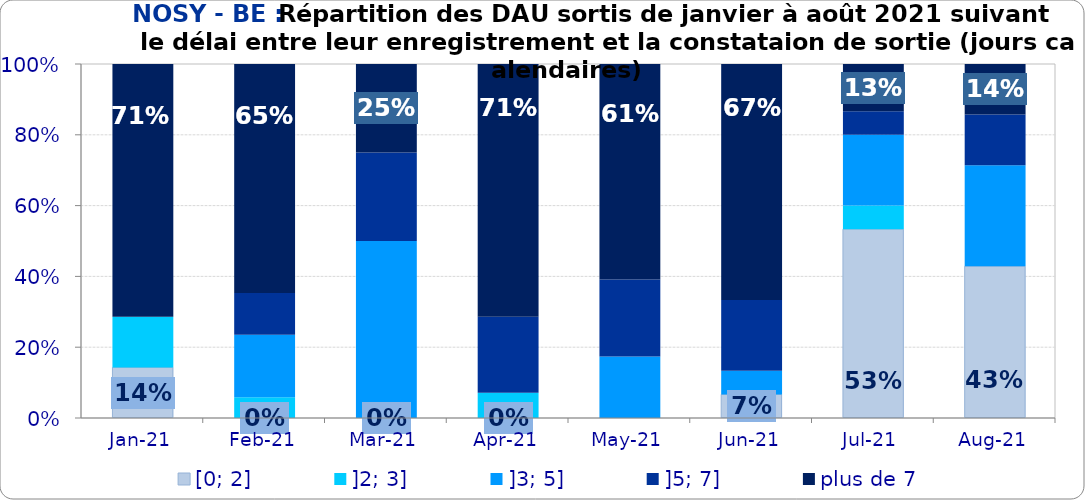
| Category | [0; 2] | ]2; 3] | ]3; 5] | ]5; 7] | plus de 7 |
|---|---|---|---|---|---|
| 2021-01-01 | 0.143 | 0.143 | 0 | 0 | 0.714 |
| 2021-02-01 | 0 | 0.059 | 0.176 | 0.118 | 0.647 |
| 2021-03-01 | 0 | 0 | 0.5 | 0.25 | 0.25 |
| 2021-04-01 | 0 | 0.071 | 0 | 0.214 | 0.714 |
| 2021-05-01 | 0 | 0 | 0.174 | 0.217 | 0.609 |
| 2021-06-01 | 0.067 | 0 | 0.067 | 0.2 | 0.667 |
| 2021-07-01 | 0.533 | 0.067 | 0.2 | 0.067 | 0.133 |
| 2021-08-01 | 0.429 | 0 | 0.286 | 0.143 | 0.143 |